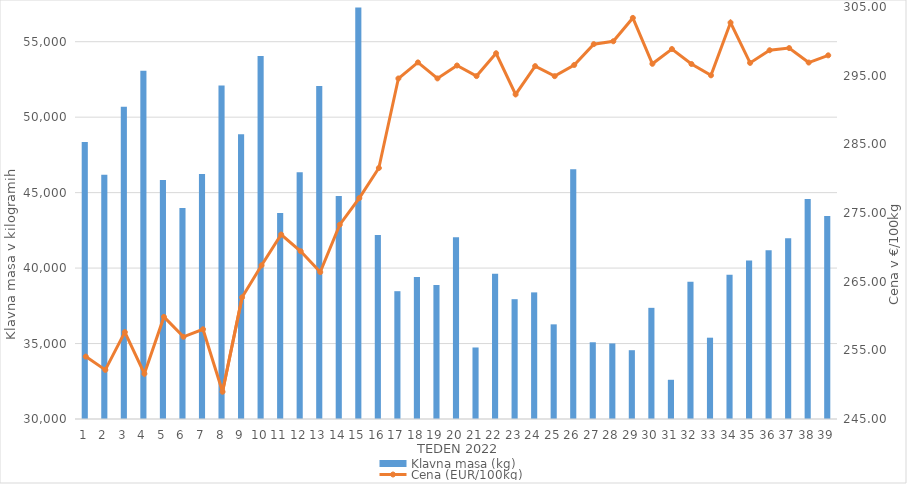
| Category | Klavna masa (kg) |
|---|---|
| 1.0 | 48349 |
| 2.0 | 46187 |
| 3.0 | 50692 |
| 4.0 | 53081 |
| 5.0 | 45844 |
| 6.0 | 43982 |
| 7.0 | 46227 |
| 8.0 | 52099 |
| 9.0 | 48872 |
| 10.0 | 54045 |
| 11.0 | 43645 |
| 12.0 | 46350 |
| 13.0 | 52061 |
| 14.0 | 44774 |
| 15.0 | 57268 |
| 16.0 | 42191 |
| 17.0 | 38469 |
| 18.0 | 39417 |
| 19.0 | 38876 |
| 20.0 | 42047 |
| 21.0 | 34739 |
| 22.0 | 39626 |
| 23.0 | 37939 |
| 24.0 | 38390 |
| 25.0 | 36272 |
| 26.0 | 46553 |
| 27.0 | 35085 |
| 28.0 | 35007 |
| 29.0 | 34559 |
| 30.0 | 37366 |
| 31.0 | 32599 |
| 32.0 | 39100 |
| 33.0 | 35388 |
| 34.0 | 39563 |
| 35.0 | 40507 |
| 36.0 | 41176 |
| 37.0 | 41983 |
| 38.0 | 44572 |
| 39.0 | 43447 |